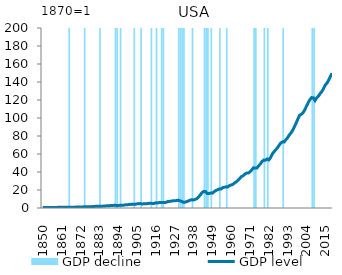
| Category | GDP decline |
|---|---|
| 1850.0 | 0 |
| 1851.0 | 0 |
| 1852.0 | 0 |
| 1853.0 | 0 |
| 1854.0 | 0 |
| 1855.0 | 0 |
| 1856.0 | 0 |
| 1857.0 | 0 |
| 1858.0 | 0 |
| 1859.0 | 0 |
| 1860.0 | 0 |
| 1861.0 | 0 |
| 1862.0 | 0 |
| 1863.0 | 0 |
| 1864.0 | 0 |
| 1865.0 | 0 |
| 1866.0 | 200 |
| 1867.0 | 0 |
| 1868.0 | 0 |
| 1869.0 | 0 |
| 1870.0 | 0 |
| 1871.0 | 0 |
| 1872.0 | 0 |
| 1873.0 | 0 |
| 1874.0 | 0 |
| 1875.0 | 200 |
| 1876.0 | 0 |
| 1877.0 | 0 |
| 1878.0 | 0 |
| 1879.0 | 0 |
| 1880.0 | 0 |
| 1881.0 | 0 |
| 1882.0 | 0 |
| 1883.0 | 0 |
| 1884.0 | 200 |
| 1885.0 | 0 |
| 1886.0 | 0 |
| 1887.0 | 0 |
| 1888.0 | 0 |
| 1889.0 | 0 |
| 1890.0 | 0 |
| 1891.0 | 0 |
| 1892.0 | 0 |
| 1893.0 | 200 |
| 1894.0 | 200 |
| 1895.0 | 0 |
| 1896.0 | 200 |
| 1897.0 | 0 |
| 1898.0 | 0 |
| 1899.0 | 0 |
| 1900.0 | 0 |
| 1901.0 | 0 |
| 1902.0 | 0 |
| 1903.0 | 0 |
| 1904.0 | 200 |
| 1905.0 | 0 |
| 1906.0 | 0 |
| 1907.0 | 0 |
| 1908.0 | 200 |
| 1909.0 | 0 |
| 1910.0 | 0 |
| 1911.0 | 0 |
| 1912.0 | 0 |
| 1913.0 | 0 |
| 1914.0 | 200 |
| 1915.0 | 0 |
| 1916.0 | 0 |
| 1917.0 | 200 |
| 1918.0 | 0 |
| 1919.0 | 0 |
| 1920.0 | 200 |
| 1921.0 | 200 |
| 1922.0 | 0 |
| 1923.0 | 0 |
| 1924.0 | 0 |
| 1925.0 | 0 |
| 1926.0 | 0 |
| 1927.0 | 0 |
| 1928.0 | 0 |
| 1929.0 | 0 |
| 1930.0 | 200 |
| 1931.0 | 200 |
| 1932.0 | 200 |
| 1933.0 | 200 |
| 1934.0 | 0 |
| 1935.0 | 0 |
| 1936.0 | 0 |
| 1937.0 | 0 |
| 1938.0 | 200 |
| 1939.0 | 0 |
| 1940.0 | 0 |
| 1941.0 | 0 |
| 1942.0 | 0 |
| 1943.0 | 0 |
| 1944.0 | 0 |
| 1945.0 | 200 |
| 1946.0 | 200 |
| 1947.0 | 200 |
| 1948.0 | 0 |
| 1949.0 | 200 |
| 1950.0 | 0 |
| 1951.0 | 0 |
| 1952.0 | 0 |
| 1953.0 | 0 |
| 1954.0 | 200 |
| 1955.0 | 0 |
| 1956.0 | 0 |
| 1957.0 | 0 |
| 1958.0 | 200 |
| 1959.0 | 0 |
| 1960.0 | 0 |
| 1961.0 | 0 |
| 1962.0 | 0 |
| 1963.0 | 0 |
| 1964.0 | 0 |
| 1965.0 | 0 |
| 1966.0 | 0 |
| 1967.0 | 0 |
| 1968.0 | 0 |
| 1969.0 | 0 |
| 1970.0 | 0 |
| 1971.0 | 0 |
| 1972.0 | 0 |
| 1973.0 | 0 |
| 1974.0 | 200 |
| 1975.0 | 200 |
| 1976.0 | 0 |
| 1977.0 | 0 |
| 1978.0 | 0 |
| 1979.0 | 0 |
| 1980.0 | 200 |
| 1981.0 | 0 |
| 1982.0 | 200 |
| 1983.0 | 0 |
| 1984.0 | 0 |
| 1985.0 | 0 |
| 1986.0 | 0 |
| 1987.0 | 0 |
| 1988.0 | 0 |
| 1989.0 | 0 |
| 1990.0 | 0 |
| 1991.0 | 200 |
| 1992.0 | 0 |
| 1993.0 | 0 |
| 1994.0 | 0 |
| 1995.0 | 0 |
| 1996.0 | 0 |
| 1997.0 | 0 |
| 1998.0 | 0 |
| 1999.0 | 0 |
| 2000.0 | 0 |
| 2001.0 | 0 |
| 2002.0 | 0 |
| 2003.0 | 0 |
| 2004.0 | 0 |
| 2005.0 | 0 |
| 2006.0 | 0 |
| 2007.0 | 0 |
| 2008.0 | 200 |
| 2009.0 | 200 |
| 2010.0 | 0 |
| 2011.0 | 0 |
| 2012.0 | 0 |
| 2013.0 | 0 |
| 2014.0 | 0 |
| 2015.0 | 0 |
| 2016.0 | 0 |
| 2017.0 | 0 |
| 2018.0 | 0 |
| 2019.0 | 0 |